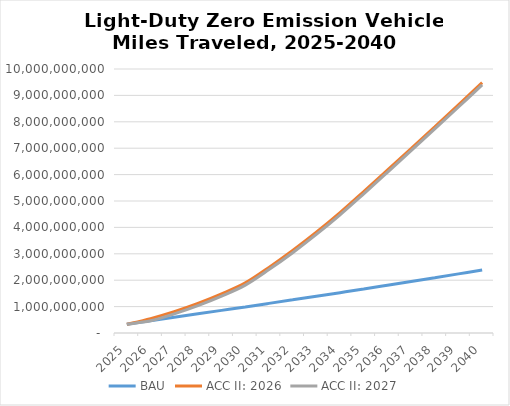
| Category | BAU | ACC II: 2026 | ACC II: 2027 |
|---|---|---|---|
| 2025.0 | 332135075.384 | 332135075.384 | 332135075.384 |
| 2026.0 | 463157133.656 | 545589470.988 | 463157133.656 |
| 2027.0 | 594258475.524 | 808084169.353 | 725715057.344 |
| 2028.0 | 725438799.79 | 1119713046.928 | 1037406503.392 |
| 2029.0 | 856692600.603 | 1480560301.414 | 1398316351.104 |
| 2030.0 | 988037272.77 | 1896888014.043 | 1814705095.626 |
| 2031.0 | 1121666942.974 | 2485375760.107 | 2403127300.083 |
| 2032.0 | 1256273117.43 | 3124827101.267 | 3042513242.36 |
| 2033.0 | 1391874315.616 | 3815965705.611 | 3733586173.215 |
| 2034.0 | 1528459538.286 | 4559446086.543 | 4477001930.255 |
| 2035.0 | 1666049331.416 | 5356015026.826 | 5273506626.991 |
| 2036.0 | 1807873844.808 | 6168408700.436 | 6085668466.166 |
| 2037.0 | 1950799536.049 | 6987270544.778 | 6904299733.118 |
| 2038.0 | 2094806756.013 | 7812520509.491 | 7729321028.908 |
| 2039.0 | 2239924689.246 | 8644258428.149 | 8560830856.323 |
| 2040.0 | 2386125212.174 | 9482372707.627 | 9398718611.429 |